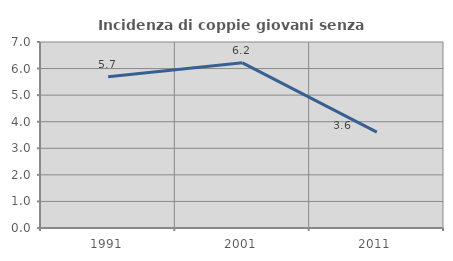
| Category | Incidenza di coppie giovani senza figli |
|---|---|
| 1991.0 | 5.695 |
| 2001.0 | 6.217 |
| 2011.0 | 3.608 |